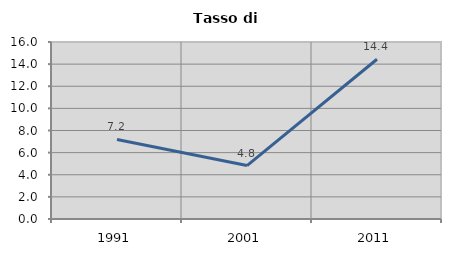
| Category | Tasso di disoccupazione   |
|---|---|
| 1991.0 | 7.191 |
| 2001.0 | 4.829 |
| 2011.0 | 14.442 |